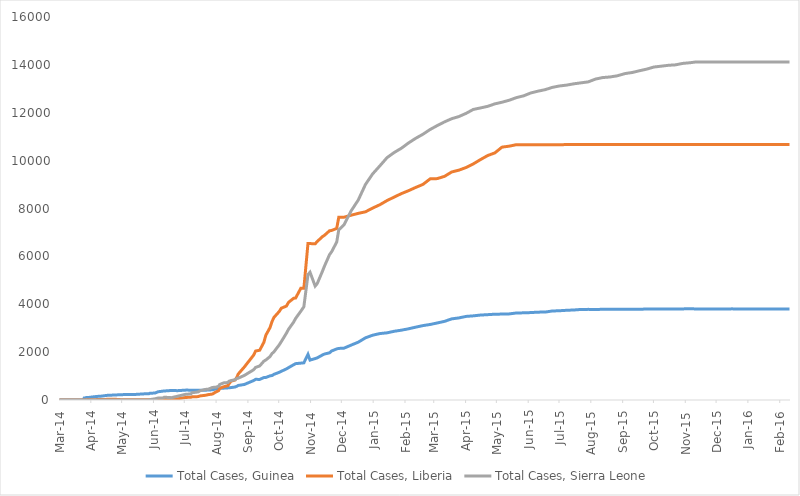
| Category | Total Cases, Guinea | Total Cases, Liberia | Total Cases, Sierra Leone |
|---|---|---|---|
| 2014-03-01 | 0 | 0 | 0 |
| 2014-03-02 | 0 | 0 | 0 |
| 2014-03-03 | 0 | 0 | 0 |
| 2014-03-04 | 0 | 0 | 0 |
| 2014-03-05 | 0 | 0 | 0 |
| 2014-03-06 | 0 | 0 | 0 |
| 2014-03-07 | 0 | 0 | 0 |
| 2014-03-08 | 0 | 0 | 0 |
| 2014-03-09 | 0 | 0 | 0 |
| 2014-03-10 | 0 | 0 | 0 |
| 2014-03-11 | 0 | 0 | 0 |
| 2014-03-12 | 0 | 0 | 0 |
| 2014-03-13 | 0 | 0 | 0 |
| 2014-03-14 | 0 | 0 | 0 |
| 2014-03-15 | 0 | 0 | 0 |
| 2014-03-16 | 0 | 0 | 0 |
| 2014-03-17 | 0 | 0 | 0 |
| 2014-03-18 | 0 | 0 | 0 |
| 2014-03-19 | 0 | 0 | 0 |
| 2014-03-20 | 0 | 0 | 0 |
| 2014-03-21 | 0 | 0 | 0 |
| 2014-03-22 | 0 | 0 | 0 |
| 2014-03-23 | 0 | 0 | 0 |
| 2014-03-24 | 0 | 0 | 0 |
| 2014-03-25 | 86 | 0 | 0 |
| 2014-03-26 | 86 | 0 | 0 |
| 2014-03-27 | 103 | 8 | 6 |
| 2014-03-31 | 112 | 8 | 0 |
| 2014-04-01 | 122 | 8 | 0 |
| 2014-04-02 | 127 | 8 | 0 |
| 2014-04-07 | 151 | 18 | 0 |
| 2014-04-10 | 157 | 22 | 0 |
| 2014-04-17 | 197 | 27 | 0 |
| 2014-04-21 | 203 | 27 | 0 |
| 2014-04-23 | 208 | 34 | 0 |
| 2014-04-30 | 221 | 13 | 0 |
| 2014-05-05 | 231 | 13 | 0 |
| 2014-05-14 | 233 | 12 | 0 |
| 2014-05-23 | 258 | 12 | 0 |
| 2014-05-27 | 258 | 12 | 1 |
| 2014-05-28 | 281 | 12 | 16 |
| 2014-06-02 | 291 | 13 | 50 |
| 2014-06-05 | 344 | 13 | 81 |
| 2014-06-10 | 372 | 15 | 89 |
| 2014-06-11 | 376 | 15 | 117 |
| 2014-06-18 | 398 | 33 | 97 |
| 2014-06-24 | 390 | 51 | 158 |
| 2014-07-02 | 413 | 107 | 239 |
| 2014-07-07 | 412 | 115 | 252 |
| 2014-07-08 | 408 | 131 | 305 |
| 2014-07-14 | 409 | 142 | 337 |
| 2014-07-16 | 406 | 172 | 386 |
| 2014-07-21 | 410 | 196 | 442 |
| 2014-07-24 | 415 | 224 | 454 |
| 2014-07-28 | 427 | 249 | 525 |
| 2014-07-31 | 460 | 329 | 533 |
| 2014-08-03 | 472 | 391 | 574 |
| 2014-08-04 | 485 | 486 | 646 |
| 2014-08-08 | 495 | 554 | 717 |
| 2014-08-12 | 506 | 599 | 730 |
| 2014-08-13 | 510 | 670 | 783 |
| 2014-08-15 | 519 | 786 | 810 |
| 2014-08-19 | 543 | 834 | 848 |
| 2014-08-21 | 579 | 972 | 907 |
| 2014-08-22 | 607 | 1082 | 910 |
| 2014-08-28 | 648 | 1378 | 1026 |
| 2014-09-06 | 812 | 1871 | 1261 |
| 2014-09-08 | 862 | 2046 | 1361 |
| 2014-09-12 | 861 | 2081 | 1424 |
| 2014-09-16 | 936 | 2407 | 1620 |
| 2014-09-18 | 942 | 2710 | 1673 |
| 2014-09-22 | 1008 | 3022 | 1813 |
| 2014-09-24 | 1022 | 3280 | 1940 |
| 2014-09-26 | 1074 | 3458 | 2021 |
| 2014-10-01 | 1157 | 3696 | 2304 |
| 2014-10-03 | 1199 | 3834 | 2437 |
| 2014-10-08 | 1298 | 3924 | 2789 |
| 2014-10-10 | 1350 | 4076 | 2950 |
| 2014-10-15 | 1472 | 4249 | 3252 |
| 2014-10-17 | 1519 | 4262 | 3410 |
| 2014-10-22 | 1540 | 4665 | 3706 |
| 2014-10-25 | 1553 | 4665 | 3896 |
| 2014-10-29 | 1906 | 6535 | 5235 |
| 2014-10-31 | 1667 | 6535 | 5338 |
| 2014-11-05 | 1731 | 6525 | 4759 |
| 2014-11-07 | 1760 | 6619 | 4862 |
| 2014-11-12 | 1878 | 6822 | 5368 |
| 2014-11-14 | 1919 | 6878 | 5586 |
| 2014-11-19 | 1971 | 7069 | 6073 |
| 2014-11-21 | 2047 | 7082 | 6190 |
| 2014-11-26 | 2134 | 7168 | 6599 |
| 2014-11-28 | 2155 | 7635 | 7109 |
| 2014-12-03 | 2164 | 7635 | 7312 |
| 2014-12-10 | 2292 | 7719 | 7897 |
| 2014-12-17 | 2416 | 7797 | 8356 |
| 2014-12-24 | 2597 | 7862 | 9004 |
| 2014-12-31 | 2707 | 8018 | 9446 |
| 2015-01-07 | 2775 | 8157 | 9780 |
| 2015-01-14 | 2806 | 8331 | 10124 |
| 2015-01-21 | 2871 | 8478 | 10340 |
| 2015-01-28 | 2917 | 8622 | 10518 |
| 2015-02-04 | 2975 | 8745 | 10740 |
| 2015-02-11 | 3044 | 8881 | 10934 |
| 2015-02-18 | 3108 | 9007 | 11103 |
| 2015-02-25 | 3155 | 9238 | 11301 |
| 2015-03-04 | 3219 | 9249 | 11466 |
| 2015-03-11 | 3285 | 9343 | 11619 |
| 2015-03-18 | 3389 | 9526 | 11751 |
| 2015-03-25 | 3429 | 9602 | 11841 |
| 2015-04-01 | 3492 | 9712 | 11974 |
| 2015-04-08 | 3515 | 9862 | 12138 |
| 2015-04-15 | 3548 | 10042 | 12201 |
| 2015-04-22 | 3565 | 10212 | 12267 |
| 2015-04-29 | 3584 | 10322 | 12371 |
| 2015-05-06 | 3589 | 10564 | 12440 |
| 2015-05-13 | 3597 | 10604 | 12523 |
| 2015-05-20 | 3635 | 10666 | 12632 |
| 2015-05-27 | 3641 | 10666 | 12706 |
| 2015-06-03 | 3652 | 10666 | 12827 |
| 2015-06-10 | 3670 | 10666 | 12901 |
| 2015-06-17 | 3674 | 10666 | 12965 |
| 2015-06-24 | 3718 | 10666 | 13059 |
| 2015-07-01 | 3729 | 10666 | 13119 |
| 2015-07-08 | 3748 | 10670 | 13155 |
| 2015-07-15 | 3760 | 10673 | 13209 |
| 2015-07-22 | 3783 | 10672 | 13250 |
| 2015-07-29 | 3786 | 10672 | 13290 |
| 2015-08-05 | 3784 | 10672 | 13406 |
| 2015-08-12 | 3787 | 10672 | 13470 |
| 2015-08-19 | 3786 | 10672 | 13494 |
| 2015-08-26 | 3792 | 10672 | 13541 |
| 2015-09-03 | 3792 | 10672 | 13638 |
| 2015-09-10 | 3792 | 10672 | 13683 |
| 2015-09-17 | 3792 | 10672 | 13756 |
| 2015-09-24 | 3800 | 10672 | 13823 |
| 2015-10-01 | 3805 | 10672 | 13911 |
| 2015-10-08 | 3804 | 10672 | 13945 |
| 2015-10-15 | 3800 | 10672 | 13982 |
| 2015-10-22 | 3803 | 10672 | 14001 |
| 2015-10-29 | 3806 | 10672 | 14061 |
| 2015-11-05 | 3810 | 10672 | 14089 |
| 2015-11-11 | 3805 | 10672 | 14122 |
| 2015-11-18 | 3804 | 10672 | 14122 |
| 2015-11-25 | 3804 | 10675 | 14122 |
| 2015-12-02 | 3804 | 10675 | 14122 |
| 2015-12-09 | 3804 | 10675 | 14122 |
| 2015-12-16 | 3807 | 10675 | 14122 |
| 2015-12-23 | 3804 | 10675 | 14122 |
| 2015-12-30 | 3804 | 10675 | 14122 |
| 2016-01-06 | 3804 | 10675 | 14122 |
| 2016-01-13 | 3804 | 10675 | 14122 |
| 2016-01-20 | 3804 | 10675 | 14123 |
| 2016-01-27 | 3804 | 10675 | 14124 |
| 2016-02-03 | 3804 | 10675 | 14124 |
| 2016-02-10 | 3804 | 10675 | 14124 |